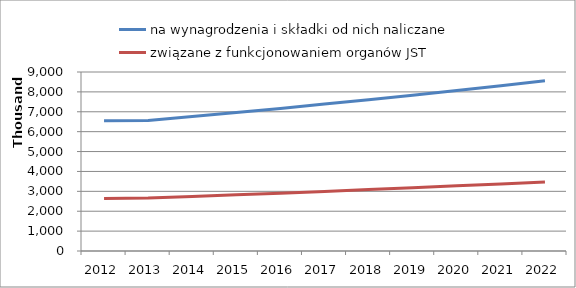
| Category | na wynagrodzenia i składki od nich naliczane | związane z funkcjonowaniem organów JST |
|---|---|---|
| 2012.0 | 6546348.09 | 2636145 |
| 2013.0 | 6561950 | 2662506 |
| 2014.0 | 6758808 | 2742382 |
| 2015.0 | 6961573 | 2824653 |
| 2016.0 | 7170420 | 2909393 |
| 2017.0 | 7385532 | 2996674 |
| 2018.0 | 7607098 | 3086575 |
| 2019.0 | 7835311 | 3179172 |
| 2020.0 | 8070371 | 3274547 |
| 2021.0 | 8312482 | 3372784 |
| 2022.0 | 8561856 | 3473967 |